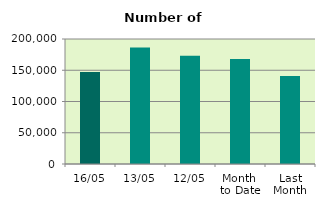
| Category | Series 0 |
|---|---|
| 16/05 | 147042 |
| 13/05 | 186478 |
| 12/05 | 173166 |
| Month 
to Date | 167945.091 |
| Last
Month | 140978.316 |